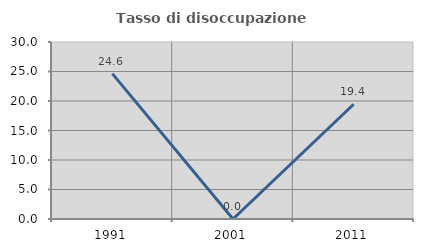
| Category | Tasso di disoccupazione giovanile  |
|---|---|
| 1991.0 | 24.638 |
| 2001.0 | 0 |
| 2011.0 | 19.444 |